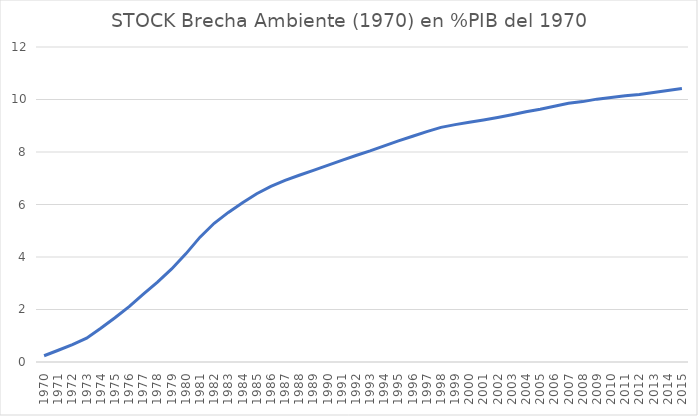
| Category | STOCK Brecha Ambiente (1970) en %PIB del 1970 |
|---|---|
| 1970.0 | 0.238 |
| 1971.0 | 0.447 |
| 1972.0 | 0.666 |
| 1973.0 | 0.909 |
| 1974.0 | 1.285 |
| 1975.0 | 1.684 |
| 1976.0 | 2.111 |
| 1977.0 | 2.582 |
| 1978.0 | 3.045 |
| 1979.0 | 3.546 |
| 1980.0 | 4.12 |
| 1981.0 | 4.756 |
| 1982.0 | 5.285 |
| 1983.0 | 5.698 |
| 1984.0 | 6.069 |
| 1985.0 | 6.411 |
| 1986.0 | 6.688 |
| 1987.0 | 6.918 |
| 1988.0 | 7.113 |
| 1989.0 | 7.302 |
| 1990.0 | 7.491 |
| 1991.0 | 7.682 |
| 1992.0 | 7.867 |
| 1993.0 | 8.043 |
| 1994.0 | 8.235 |
| 1995.0 | 8.423 |
| 1996.0 | 8.599 |
| 1997.0 | 8.778 |
| 1998.0 | 8.939 |
| 1999.0 | 9.042 |
| 2000.0 | 9.13 |
| 2001.0 | 9.219 |
| 2002.0 | 9.316 |
| 2003.0 | 9.422 |
| 2004.0 | 9.533 |
| 2005.0 | 9.629 |
| 2006.0 | 9.743 |
| 2007.0 | 9.855 |
| 2008.0 | 9.92 |
| 2009.0 | 10.014 |
| 2010.0 | 10.077 |
| 2011.0 | 10.141 |
| 2012.0 | 10.193 |
| 2013.0 | 10.27 |
| 2014.0 | 10.343 |
| 2015.0 | 10.417 |